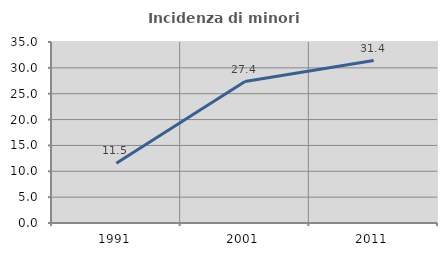
| Category | Incidenza di minori stranieri |
|---|---|
| 1991.0 | 11.538 |
| 2001.0 | 27.353 |
| 2011.0 | 31.408 |